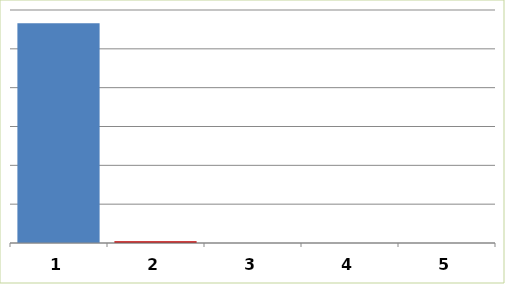
| Category | Series 0 |
|---|---|
| 0 | 5658200 |
| 1 | 48000 |
| 2 | 0 |
| 3 | 0 |
| 4 | 0 |